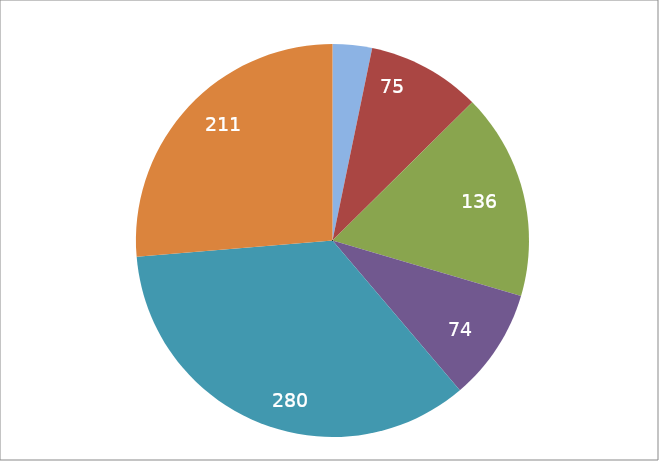
| Category | Series 1 |
|---|---|
| 0 | 26 |
| 1 | 75 |
| 2 | 136 |
| 3 | 74 |
| 4 | 280 |
| 5 | 211 |